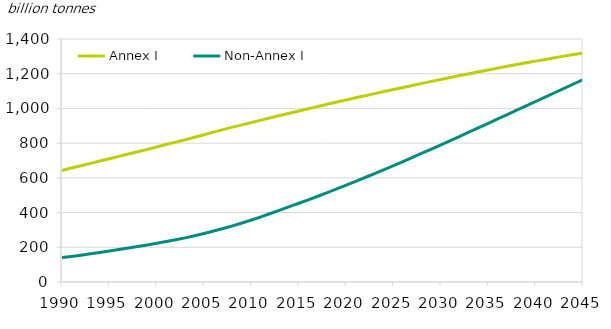
| Category | Annex I | Non-Annex I |
|---|---|---|
| 1990.0 | 642.443 | 140.524 |
| 1991.0 | 656.448 | 147.483 |
| 1992.0 | 670.043 | 154.689 |
| 1993.0 | 683.496 | 162.23 |
| 1994.0 | 696.742 | 170.086 |
| 1995.0 | 710.036 | 178.389 |
| 1996.0 | 723.552 | 186.959 |
| 1997.0 | 737.043 | 195.703 |
| 1998.0 | 750.483 | 204.574 |
| 1999.0 | 764.057 | 213.756 |
| 2000.0 | 777.965 | 223.225 |
| 2001.0 | 791.807 | 233.02 |
| 2002.0 | 805.748 | 243.262 |
| 2003.0 | 819.967 | 254.345 |
| 2004.0 | 834.367 | 266.462 |
| 2005.0 | 848.784 | 279.471 |
| 2006.0 | 863.275 | 293.386 |
| 2007.0 | 877.836 | 308.203 |
| 2008.0 | 892.136 | 323.597 |
| 2009.0 | 905.352 | 339.768 |
| 2010.0 | 919.124 | 357.203 |
| 2011.0 | 932.77 | 375.54 |
| 2012.0 | 946.171 | 394.49 |
| 2013.0 | 959.488 | 413.88 |
| 2014.0 | 972.557 | 433.918 |
| 2015.0 | 985.569 | 453.787 |
| 2016.0 | 998.507 | 473.667 |
| 2017.0 | 1011.504 | 494.115 |
| 2018.0 | 1024.522 | 515.239 |
| 2019.0 | 1037.241 | 536.94 |
| 2020.0 | 1048.923 | 558.089 |
| 2021.0 | 1061.111 | 579.893 |
| 2022.0 | 1073.278 | 602.011 |
| 2023.0 | 1085.35 | 624.574 |
| 2024.0 | 1097.306 | 647.467 |
| 2025.0 | 1109.168 | 670.677 |
| 2026.0 | 1120.941 | 694.154 |
| 2027.0 | 1132.62 | 717.878 |
| 2028.0 | 1144.204 | 741.845 |
| 2029.0 | 1155.682 | 766.032 |
| 2030.0 | 1167.041 | 790.413 |
| 2031.0 | 1178.271 | 814.96 |
| 2032.0 | 1189.365 | 839.645 |
| 2033.0 | 1200.315 | 864.445 |
| 2034.0 | 1211.115 | 889.339 |
| 2035.0 | 1221.761 | 914.312 |
| 2036.0 | 1232.251 | 939.351 |
| 2037.0 | 1242.584 | 964.445 |
| 2038.0 | 1252.76 | 989.584 |
| 2039.0 | 1262.777 | 1014.757 |
| 2040.0 | 1272.633 | 1039.957 |
| 2041.0 | 1282.323 | 1065.158 |
| 2042.0 | 1291.849 | 1090.355 |
| 2043.0 | 1301.213 | 1115.541 |
| 2044.0 | 1310.416 | 1140.708 |
| 2045.0 | 1319.458 | 1165.851 |